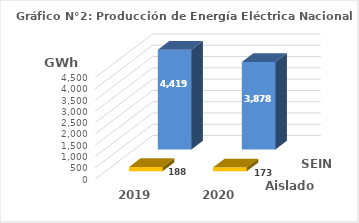
| Category | Aislados | SEIN |
|---|---|---|
| 2019.0 | 188.183 | 4419.45 |
| 2020.0 | 172.607 | 3878.368 |